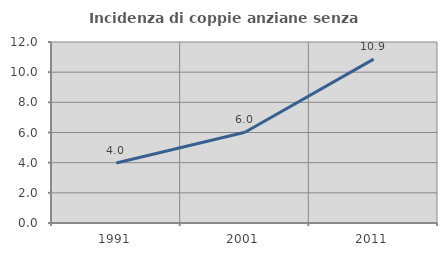
| Category | Incidenza di coppie anziane senza figli  |
|---|---|
| 1991.0 | 3.978 |
| 2001.0 | 6.015 |
| 2011.0 | 10.865 |